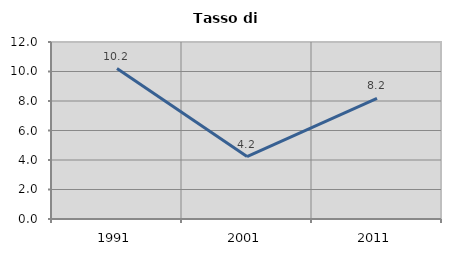
| Category | Tasso di disoccupazione   |
|---|---|
| 1991.0 | 10.201 |
| 2001.0 | 4.235 |
| 2011.0 | 8.177 |